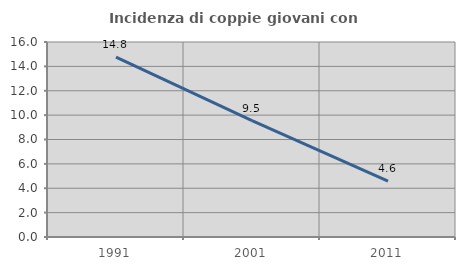
| Category | Incidenza di coppie giovani con figli |
|---|---|
| 1991.0 | 14.765 |
| 2001.0 | 9.547 |
| 2011.0 | 4.577 |